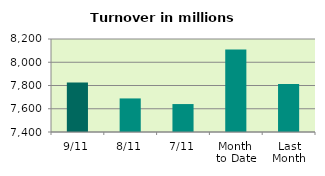
| Category | Series 0 |
|---|---|
| 9/11 | 7825.587 |
| 8/11 | 7688.745 |
| 7/11 | 7640.387 |
| Month 
to Date | 8109.385 |
| Last
Month | 7813.06 |